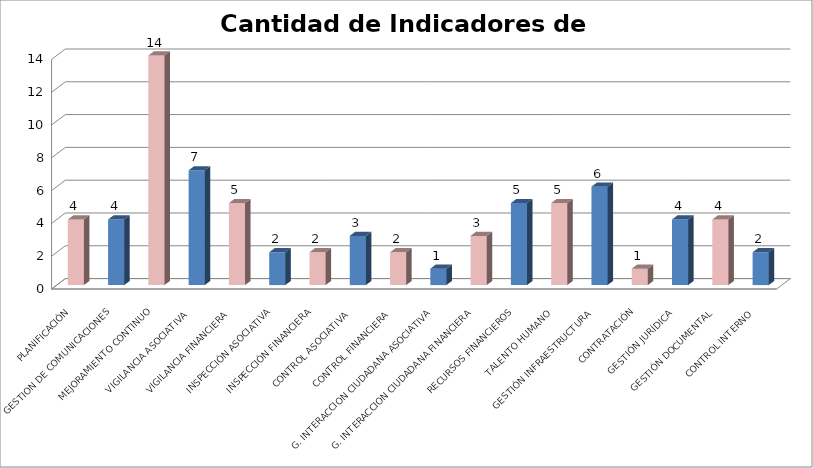
| Category | Series 0 |
|---|---|
| PLANIFICACIÓN | 4 |
| GESTION DE COMUNICACIONES | 4 |
| MEJORAMIENTO CONTINUO | 14 |
| VIGILANCIA ASOCIATIVA | 7 |
| VIGILANCIA FINANCIERA | 5 |
| INSPECCIÓN ASOCIATIVA | 2 |
| INSPECCIÓN FINANCIERA | 2 |
| CONTROL ASOCIATIVA | 3 |
| CONTROL FINANCIERA | 2 |
| G. INTERACCION CIUDADANA ASOCIATIVA | 1 |
| G. INTERACCION CIUDADANA FINANCIERA | 3 |
| RECURSOS FINANCIEROS | 5 |
| TALENTO HUMANO | 5 |
| GESTIÓN INFRAESTRUCTURA | 6 |
| CONTRATACIÓN | 1 |
| GESTIÓN JURÍDICA | 4 |
| GESTIÓN DOCUMENTAL | 4 |
| CONTROL INTERNO | 2 |